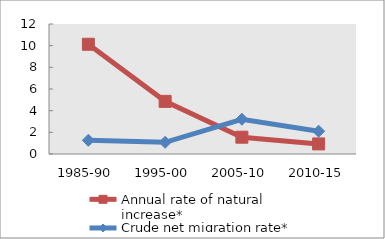
| Category | Annual rate of natural increase* | Crude net migration rate* |
|---|---|---|
| 1985-90 | 10.13 | 1.269 |
| 1995-00 | 4.858 | 1.076 |
| 2005-10 | 1.551 | 3.209 |
| 2010-15 | 0.93 | 2.108 |